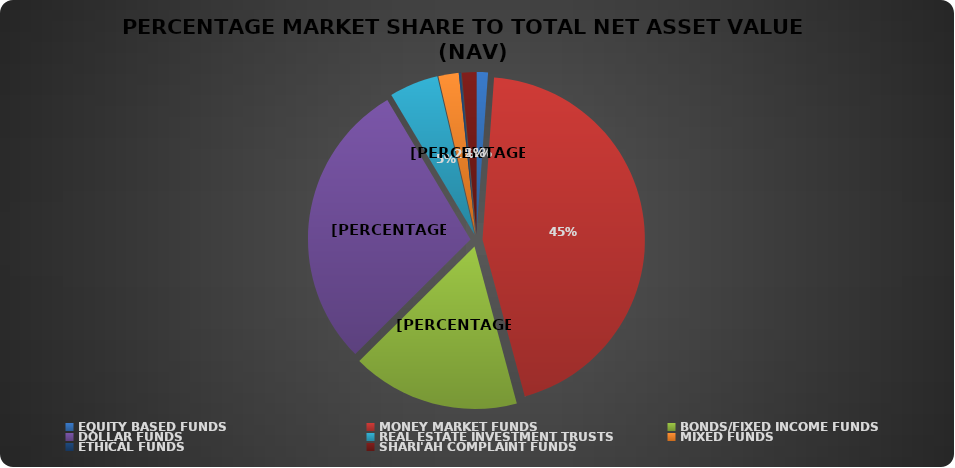
| Category | NET ASSET VALUE |
|---|---|
| EQUITY BASED FUNDS | 21799255745.14 |
| MONEY MARKET FUNDS | 857163632618.473 |
| BONDS/FIXED INCOME FUNDS | 321156453816.646 |
| DOLLAR FUNDS | 554621583051.023 |
| REAL ESTATE INVESTMENT TRUSTS | 93594876666.31 |
| MIXED FUNDS | 38936521066.393 |
| ETHICAL FUNDS | 3821769493.7 |
| SHARI'AH COMPLAINT FUNDS | 27781533807.06 |